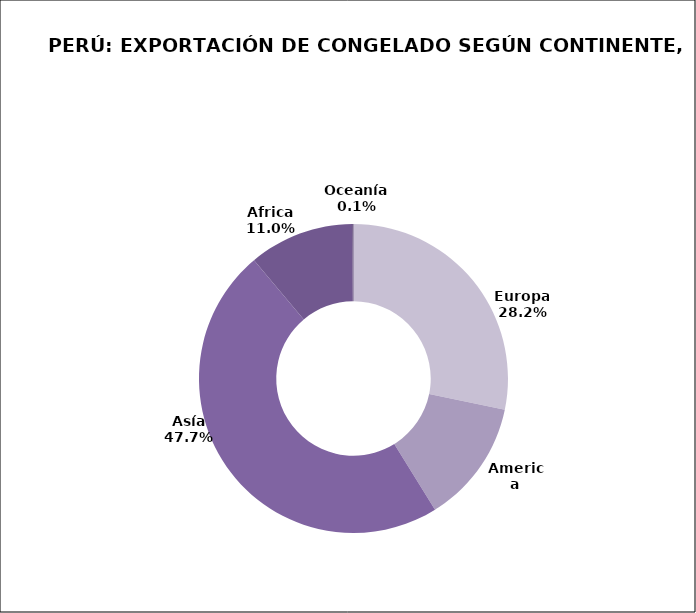
| Category | Series 0 |
|---|---|
| Europa | 132631.137 |
| America | 60657.212 |
| Asía | 224086.566 |
| Africa | 51638.757 |
| Oceanía | 652.519 |